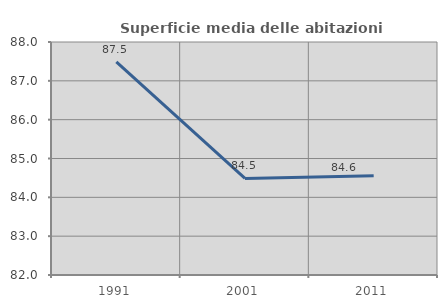
| Category | Superficie media delle abitazioni occupate |
|---|---|
| 1991.0 | 87.486 |
| 2001.0 | 84.487 |
| 2011.0 | 84.558 |